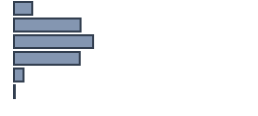
| Category | Percentatge |
|---|---|
| 0 | 7.609 |
| 1 | 27.739 |
| 2 | 32.957 |
| 3 | 27.391 |
| 4 | 3.957 |
| 5 | 0.348 |